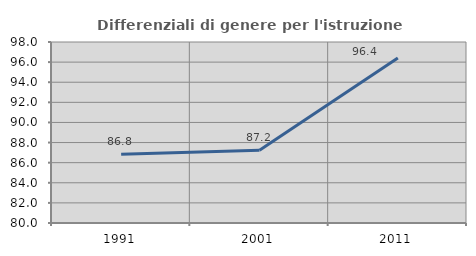
| Category | Differenziali di genere per l'istruzione superiore |
|---|---|
| 1991.0 | 86.841 |
| 2001.0 | 87.233 |
| 2011.0 | 96.408 |